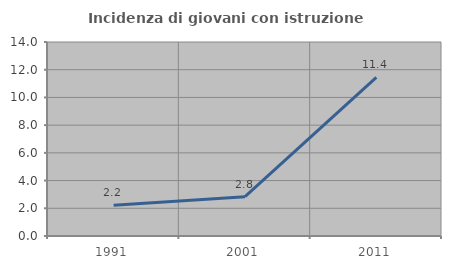
| Category | Incidenza di giovani con istruzione universitaria |
|---|---|
| 1991.0 | 2.215 |
| 2001.0 | 2.841 |
| 2011.0 | 11.446 |